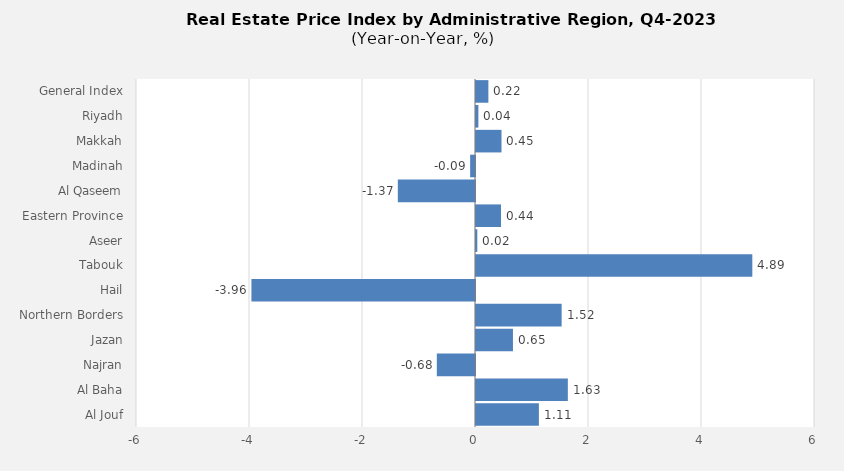
| Category | 2023 |
|---|---|
| General Index | 0.219 |
| Riyadh | 0.042 |
| Makkah | 0.451 |
| Madinah | -0.086 |
| Al Qaseem | -1.366 |
| Eastern Province | 0.442 |
| Aseer | 0.023 |
| Tabouk | 4.891 |
| Hail | -3.957 |
| Northern Borders | 1.516 |
| Jazan | 0.654 |
| Najran | -0.676 |
| Al Baha | 1.626 |
| Al Jouf | 1.113 |